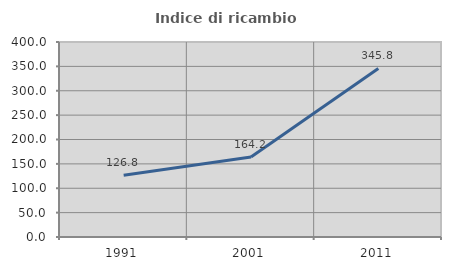
| Category | Indice di ricambio occupazionale  |
|---|---|
| 1991.0 | 126.819 |
| 2001.0 | 164.211 |
| 2011.0 | 345.755 |